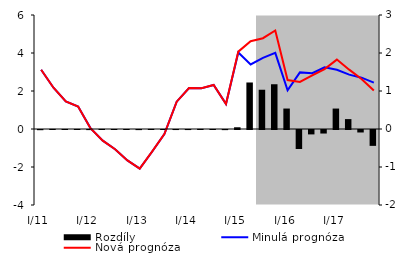
| Category | Rozdíly |
|---|---|
| 0 | -0.005 |
| 1 | 0.003 |
| 2 | 0.001 |
| 3 | 0.002 |
| 4 | -0.003 |
| 5 | 0.003 |
| 6 | 0.001 |
| 7 | 0 |
| 8 | -0.003 |
| 9 | 0.002 |
| 10 | 0.001 |
| 11 | -0.001 |
| 12 | -0.002 |
| 13 | 0.004 |
| 14 | 0.002 |
| 15 | -0.003 |
| 16 | 0.046 |
| 17 | 1.224 |
| 18 | 1.033 |
| 19 | 1.178 |
| 20 | 0.538 |
| 21 | -0.5 |
| 22 | -0.116 |
| 23 | -0.093 |
| 24 | 0.538 |
| 25 | 0.26 |
| 26 | -0.065 |
| 27 | -0.418 |